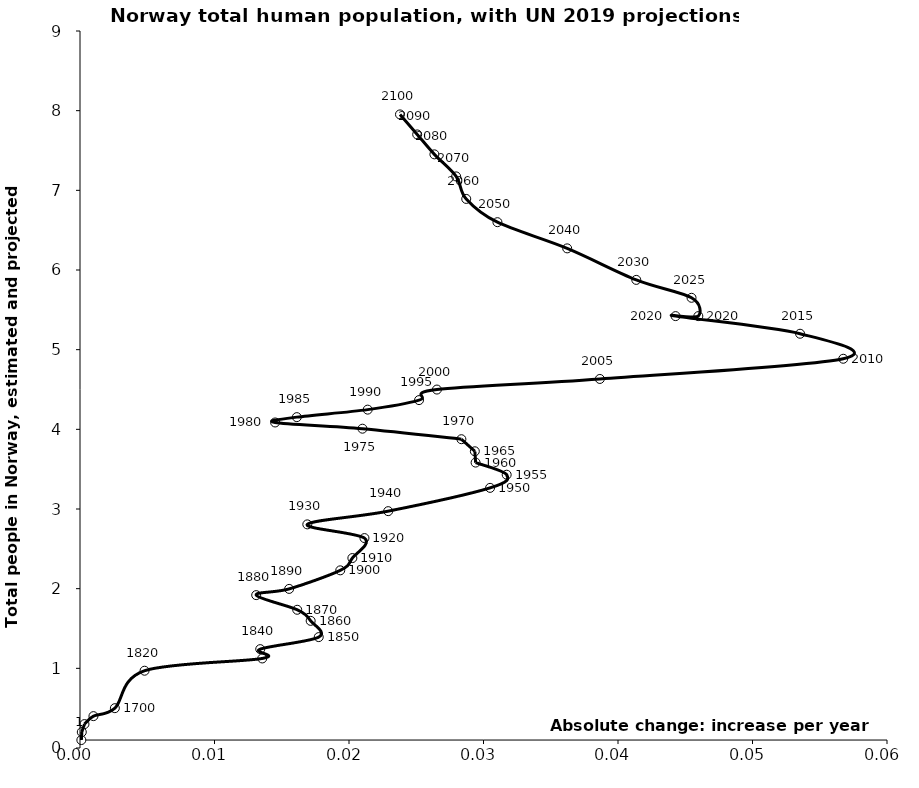
| Category | Series 0 |
|---|---|
| 0.0001 | 0.1 |
| 0.000133422281521014 | 0.2 |
| 0.0003333333333333334 | 0.3 |
| 0.001 | 0.4 |
| 0.0025909090909090908 | 0.5 |
| 0.0048000000000000004 | 0.97 |
| 0.013550000000000006 | 1.124 |
| 0.01339999999999999 | 1.241 |
| 0.01775 | 1.392 |
| 0.01715000000000001 | 1.596 |
| 0.016149999999999998 | 1.735 |
| 0.0131 | 1.919 |
| 0.015549999999999998 | 1.997 |
| 0.01934999999999999 | 2.23 |
| 0.02024999999999999 | 2.384 |
| 0.021150000000000002 | 2.635 |
| 0.016900000000000005 | 2.807 |
| 0.022913649999999963 | 2.973 |
| 0.030489333333333354 | 3.265 |
| 0.03172340000000018 | 3.43 |
| 0.029412300000000037 | 3.583 |
| 0.029355299999999973 | 3.724 |
| 0.02835679999999985 | 3.876 |
| 0.021001599999999777 | 4.008 |
| 0.014507400000000281 | 4.086 |
| 0.016120900000000125 | 4.153 |
| 0.02138899999999966 | 4.247 |
| 0.02520820000000006 | 4.367 |
| 0.02653690000000051 | 4.499 |
| 0.03865110000000014 | 4.632 |
| 0.05674719999999942 | 4.886 |
| 0.05353629999999976 | 5.2 |
| 0.04428100000000033 | 5.421 |
| 0.04597200000000061 | 5.421 |
| 0.04546720000000004 | 5.651 |
| 0.04135846666666634 | 5.876 |
| 0.03622124999999987 | 6.271 |
| 0.031036050000000027 | 6.6 |
| 0.028716399999999975 | 6.892 |
| 0.027966250000000147 | 7.175 |
| 0.026349900000000304 | 7.452 |
| 0.025070049999999934 | 7.702 |
| 0.023790199999999564 | 7.953 |